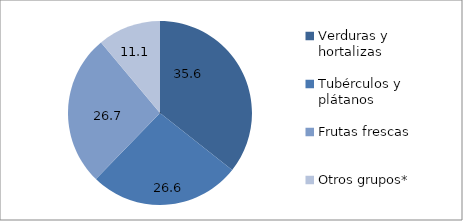
| Category | Abastecimiento mensual Bogotá |
|---|---|
| Verduras y hortalizas  | 35.642 |
| Tubérculos y plátanos  | 26.616 |
| Frutas frescas  | 26.662 |
| Otros grupos* | 11.08 |